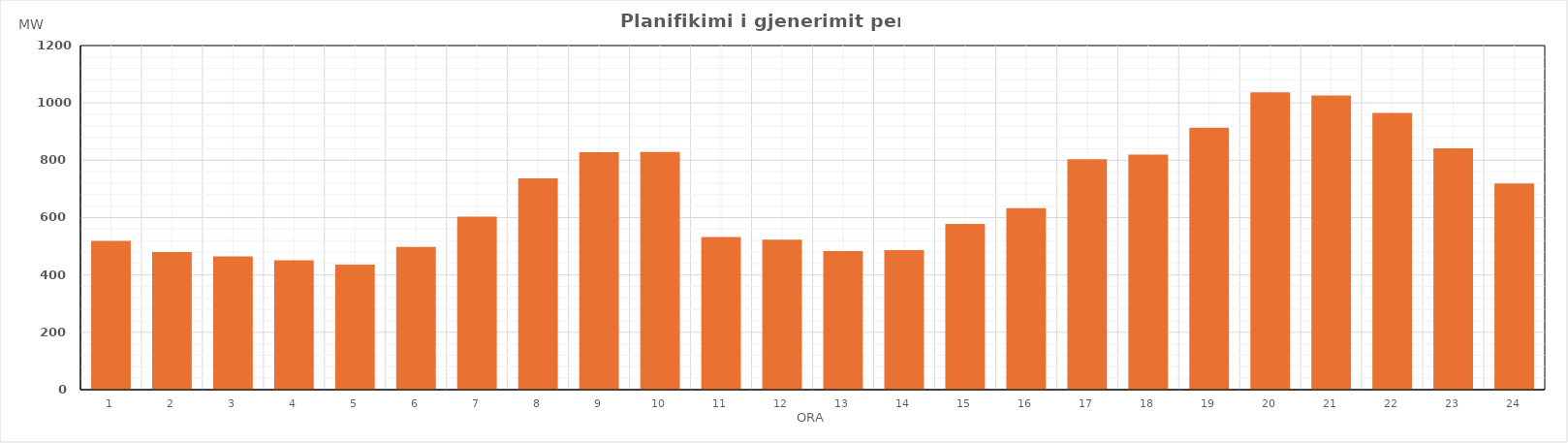
| Category | Max (MW) |
|---|---|
| 0 | 518.53 |
| 1 | 479.91 |
| 2 | 464.87 |
| 3 | 450.85 |
| 4 | 436.26 |
| 5 | 497.73 |
| 6 | 603.51 |
| 7 | 737.03 |
| 8 | 827.83 |
| 9 | 829.21 |
| 10 | 532.55 |
| 11 | 523.5 |
| 12 | 483.19 |
| 13 | 487.11 |
| 14 | 577.63 |
| 15 | 632.6 |
| 16 | 803.53 |
| 17 | 819.62 |
| 18 | 913.88 |
| 19 | 1037.23 |
| 20 | 1025.51 |
| 21 | 964.95 |
| 22 | 841.34 |
| 23 | 719.33 |